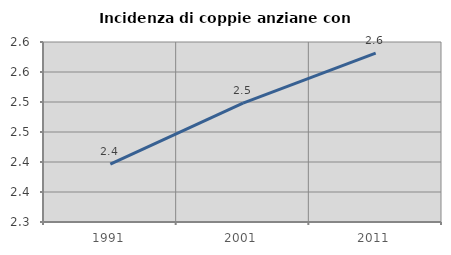
| Category | Incidenza di coppie anziane con figli |
|---|---|
| 1991.0 | 2.396 |
| 2001.0 | 2.498 |
| 2011.0 | 2.582 |